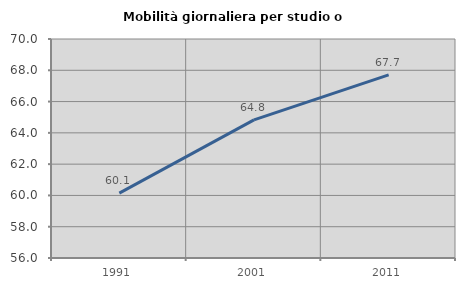
| Category | Mobilità giornaliera per studio o lavoro |
|---|---|
| 1991.0 | 60.146 |
| 2001.0 | 64.831 |
| 2011.0 | 67.711 |